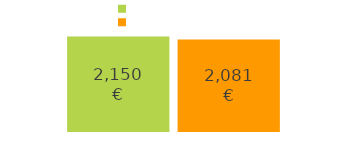
| Category | rendimento | despesas |
|---|---|---|
| rendimento: | 2150 | 2081 |